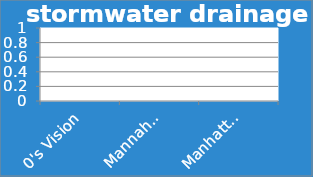
| Category | stormwater drainage |
|---|---|
| 0's Vision | 0 |
| Mannahatta (1609) | 0 |
| Manhattan (2010) | 0 |